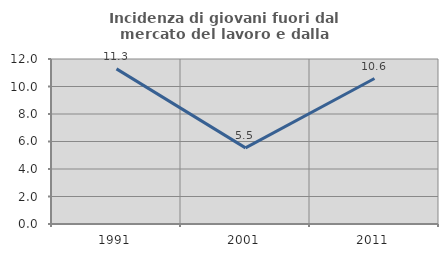
| Category | Incidenza di giovani fuori dal mercato del lavoro e dalla formazione  |
|---|---|
| 1991.0 | 11.282 |
| 2001.0 | 5.537 |
| 2011.0 | 10.58 |